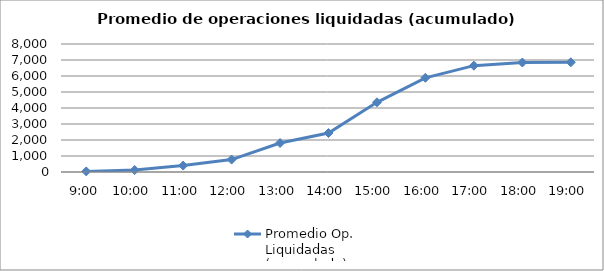
| Category | Promedio Op.
Liquidadas 
(acumulado) |
|---|---|
| 0.375 | 37.182 |
| 0.4166666666666667 | 122.909 |
| 0.4583333333333333 | 400.682 |
| 0.5 | 778.136 |
| 0.5416666666666666 | 1813.091 |
| 0.583333333333333 | 2437 |
| 0.625 | 4355.636 |
| 0.666666666666667 | 5887.273 |
| 0.708333333333333 | 6645.955 |
| 0.75 | 6842.682 |
| 0.791666666666667 | 6859.318 |